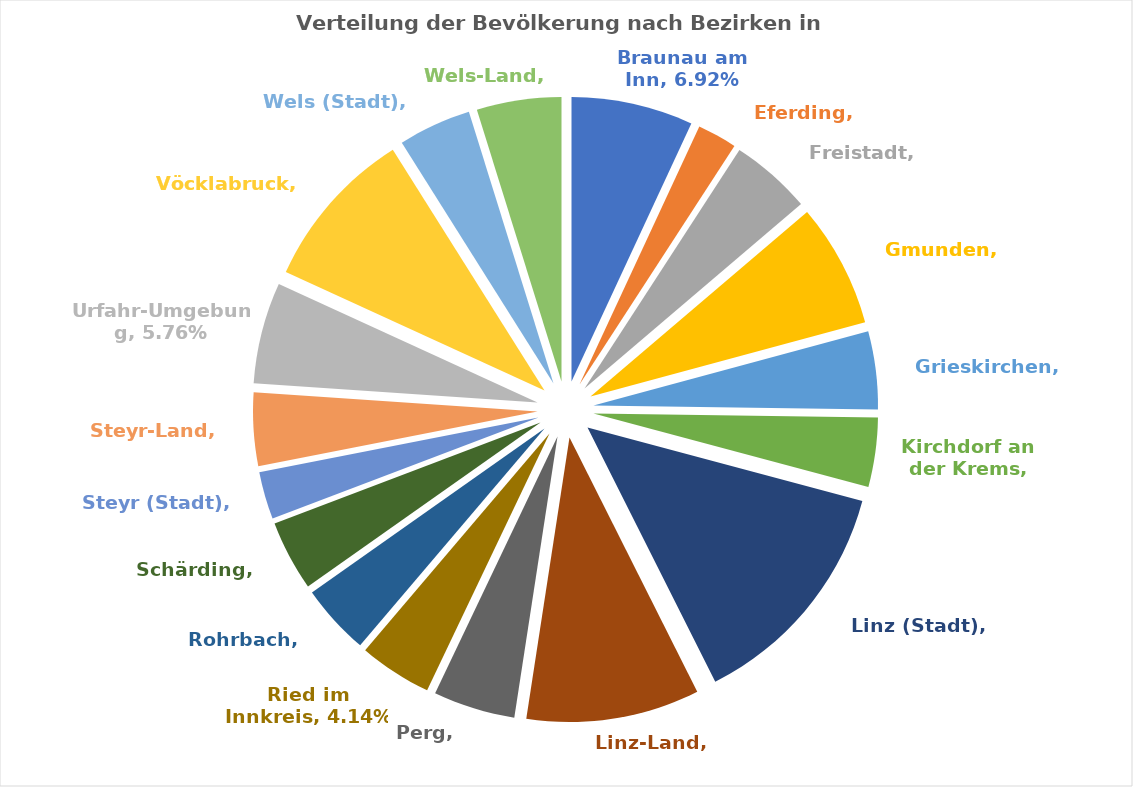
| Category | Series 0 |
|---|---|
| Braunau am Inn | 0.069 |
| Eferding | 0.022 |
| Freistadt | 0.046 |
| Gmunden | 0.07 |
| Grieskirchen | 0.044 |
| Kirchdorf an der Krems | 0.039 |
| Linz (Stadt) | 0.134 |
| Linz-Land | 0.098 |
| Perg | 0.046 |
| Ried im Innkreis | 0.041 |
| Rohrbach | 0.04 |
| Schärding | 0.04 |
| Steyr (Stadt) | 0.027 |
| Steyr-Land | 0.042 |
| Urfahr-Umgebung | 0.058 |
| Vöcklabruck | 0.092 |
| Wels (Stadt) | 0.041 |
| Wels-Land | 0.048 |